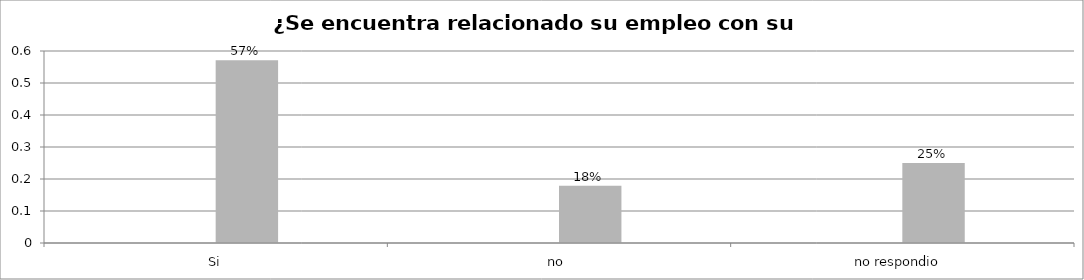
| Category | Series 0 | Series 1 | Series 2 | Series 3 |
|---|---|---|---|---|
| Si |  |  | 0.571 |  |
| no  |  |  | 0.179 |  |
| no respondio  |  |  | 0.25 |  |